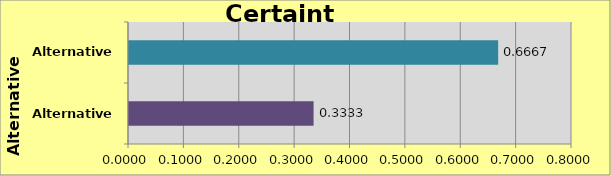
| Category | Alternative C-3 Alternative D-1 |
|---|---|
| Alternative C-3 | 0.333 |
| Alternative D-1 | 0.667 |